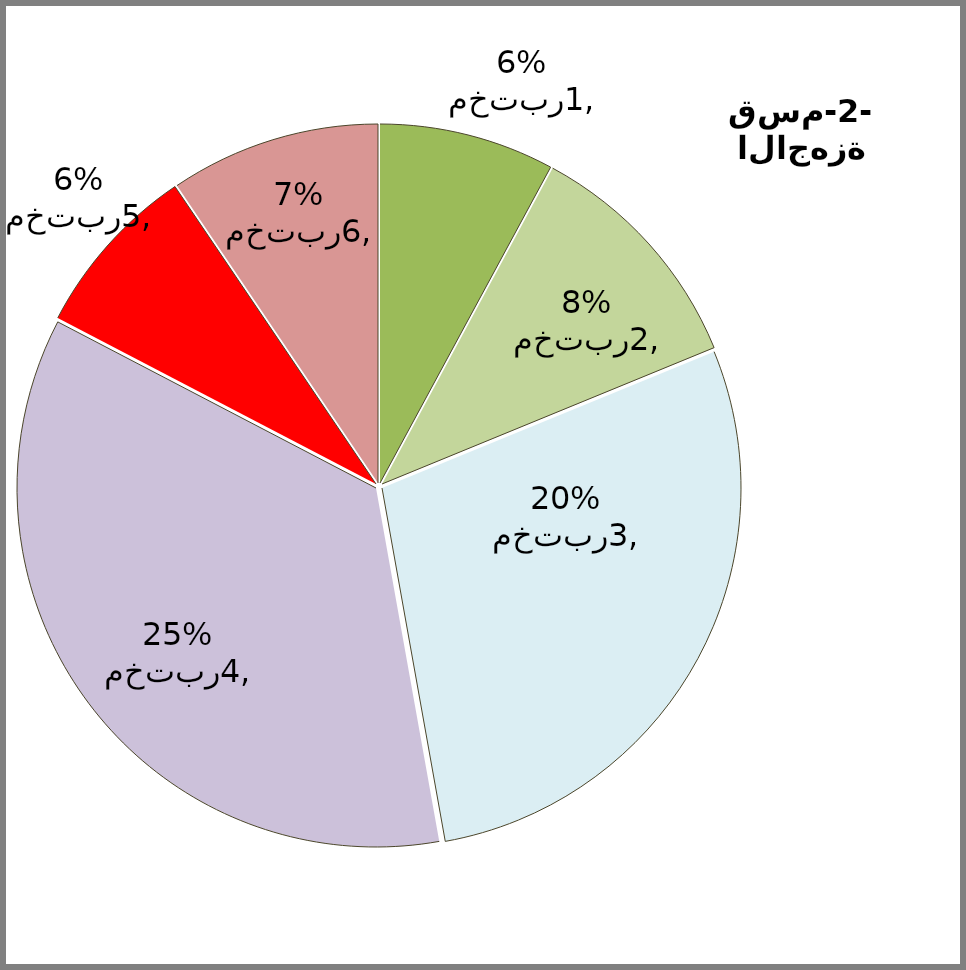
| Category | Series 2 | Series 3 | Series 1 | Series 0 |
|---|---|---|---|---|
| مختبر1 | 0.056 | 0.783 | 1 | 0.783 |
| مختبر2 | 0.077 | 0.867 | 0.545 | 0.867 |
| مختبر3 | 0.2 | 0.914 | 0.909 | 0.914 |
| مختبر4 | 0.25 | 0.8 | 0.818 | 0.8 |
| مختبر5 | 0.056 | 0.872 | 0.727 | 0.872 |
| مختبر6 | 0.067 | 0.6 | 0.455 | 0.6 |